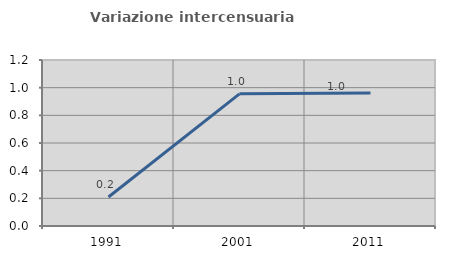
| Category | Variazione intercensuaria annua |
|---|---|
| 1991.0 | 0.21 |
| 2001.0 | 0.955 |
| 2011.0 | 0.961 |